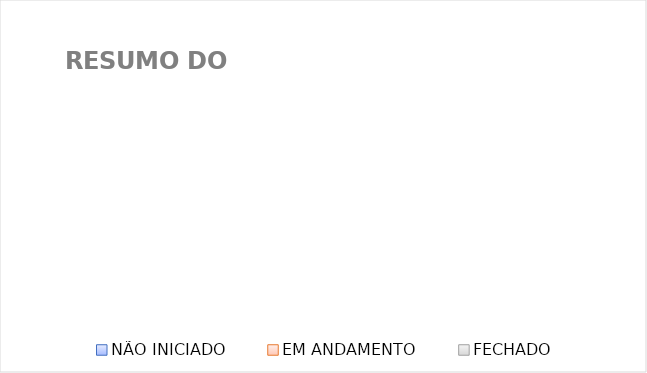
| Category | Series 0 |
|---|---|
| NÃO INICIADO | 0 |
| EM ANDAMENTO | 0 |
| FECHADO | 0 |